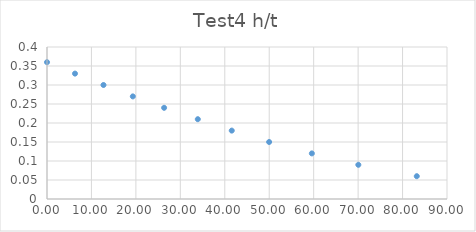
| Category | Series 0 |
|---|---|
| 0.0 | 0.36 |
| 6.3 | 0.33 |
| 12.71 | 0.3 |
| 19.31 | 0.27 |
| 26.35 | 0.24 |
| 33.93 | 0.21 |
| 41.57 | 0.18 |
| 49.98 | 0.15 |
| 59.59 | 0.12 |
| 70.05 | 0.09 |
| 83.2 | 0.06 |